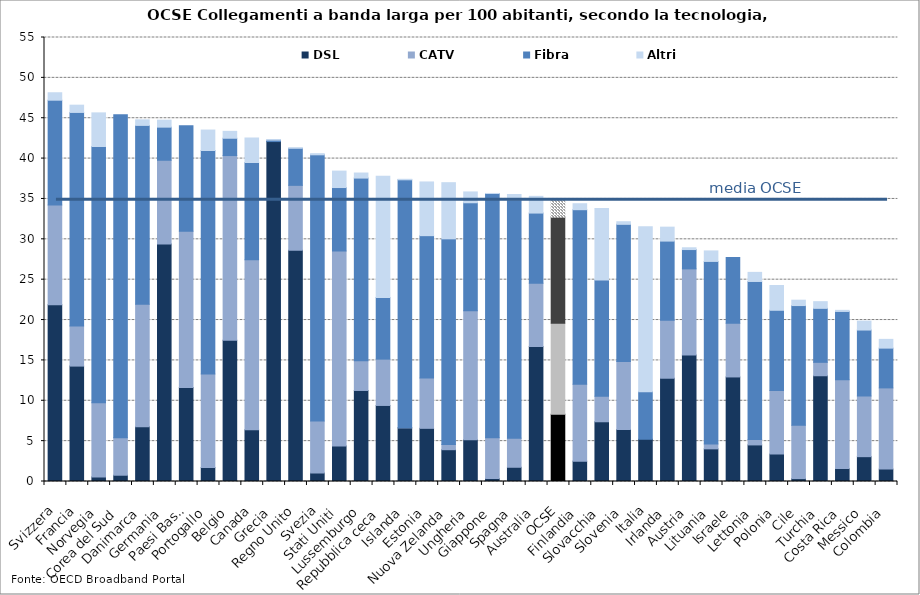
| Category | DSL | CATV | Fibra | Altri |
|---|---|---|---|---|
| Svizzera | 21.908 | 12.335 | 12.991 | 0.923 |
| Francia | 14.296 | 4.974 | 26.448 | 0.899 |
| Norvegia | 0.57 | 9.189 | 31.735 | 4.169 |
| Corea del Sud | 0.777 | 4.657 | 39.997 | 0 |
| Danimarca | 6.785 | 15.169 | 22.158 | 0.688 |
| Germania | 29.423 | 10.37 | 4.103 | 0.86 |
| Paesi Bassi | 11.636 | 19.375 | 13.049 | 0 |
| Portogallo | 1.733 | 11.573 | 27.693 | 2.536 |
| Belgio | 17.488 | 22.888 | 2.146 | 0.852 |
| Canada | 6.407 | 21.07 | 12.042 | 3.031 |
| Grecia | 42.109 | 0 | 0.185 | 0.047 |
| Regno Unito | 28.66 | 8.024 | 4.594 | 0.033 |
| Svezia | 1.052 | 6.43 | 32.985 | 0.144 |
| Stati Uniti | 4.404 | 24.149 | 7.861 | 2.035 |
| Lussemburgo | 11.277 | 3.693 | 22.616 | 0.626 |
| Repubblica ceca | 9.421 | 5.737 | 7.643 | 15.015 |
| Islanda | 6.642 | 0.029 | 30.701 | 0.064 |
| Estonia | 6.586 | 6.232 | 17.635 | 6.653 |
| Nuova Zelanda | 3.939 | 0.644 | 25.478 | 6.954 |
| Ungheria | 5.166 | 15.986 | 13.376 | 1.342 |
| Giappone | 0.37 | 5.063 | 30.246 | 0.001 |
| Spagna | 1.763 | 3.597 | 29.541 | 0.652 |
| Australia | 16.711 | 7.849 | 8.692 | 2.07 |
| OCSE | 8.324 | 11.267 | 13.163 | 2.161 |
| Finlandia | 2.519 | 9.538 | 21.613 | 0.738 |
| Slovacchia | 7.399 | 3.162 | 14.397 | 8.871 |
| Slovenia | 6.437 | 8.442 | 16.977 | 0.324 |
| Italia | 5.233 | 0 | 5.889 | 20.428 |
| Irlanda | 12.793 | 7.196 | 9.791 | 1.727 |
| Austria | 15.655 | 10.685 | 2.392 | 0.221 |
| Lituania | 4.044 | 0.614 | 22.604 | 1.301 |
| Israele | 12.952 | 6.653 | 8.146 | 0 |
| Lettonia | 4.531 | 0.667 | 19.581 | 1.125 |
| Polonia | 3.398 | 7.871 | 9.941 | 3.067 |
| Cile | 0.36 | 6.598 | 14.836 | 0.666 |
| Turchia | 13.099 | 1.664 | 6.687 | 0.827 |
| Costa Rica | 1.597 | 10.997 | 8.47 | 0.137 |
| Messico | 3.076 | 7.515 | 8.171 | 1.106 |
| Colombia | 1.535 | 10.059 | 4.928 | 1.084 |